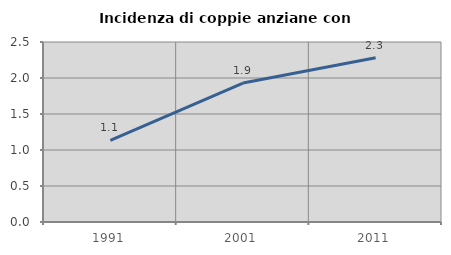
| Category | Incidenza di coppie anziane con figli |
|---|---|
| 1991.0 | 1.132 |
| 2001.0 | 1.931 |
| 2011.0 | 2.281 |